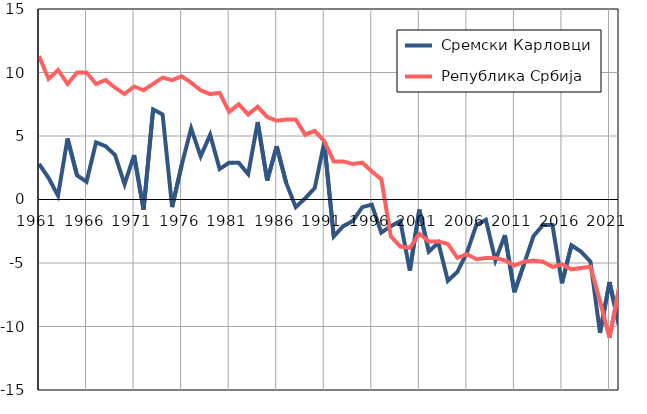
| Category |  Сремски Карловци |  Република Србија |
|---|---|---|
| 1961.0 | 2.8 | 11.3 |
| 1962.0 | 1.7 | 9.5 |
| 1963.0 | 0.3 | 10.2 |
| 1964.0 | 4.8 | 9.1 |
| 1965.0 | 1.9 | 10 |
| 1966.0 | 1.4 | 10 |
| 1967.0 | 4.5 | 9.1 |
| 1968.0 | 4.2 | 9.4 |
| 1969.0 | 3.5 | 8.8 |
| 1970.0 | 1.2 | 8.3 |
| 1971.0 | 3.5 | 8.9 |
| 1972.0 | -0.8 | 8.6 |
| 1973.0 | 7.1 | 9.1 |
| 1974.0 | 6.7 | 9.6 |
| 1975.0 | -0.6 | 9.4 |
| 1976.0 | 2.7 | 9.7 |
| 1977.0 | 5.6 | 9.2 |
| 1978.0 | 3.4 | 8.6 |
| 1979.0 | 5.1 | 8.3 |
| 1980.0 | 2.4 | 8.4 |
| 1981.0 | 2.9 | 6.9 |
| 1982.0 | 2.9 | 7.5 |
| 1983.0 | 2 | 6.7 |
| 1984.0 | 6.1 | 7.3 |
| 1985.0 | 1.5 | 6.5 |
| 1986.0 | 4.2 | 6.2 |
| 1987.0 | 1.3 | 6.3 |
| 1988.0 | -0.6 | 6.3 |
| 1989.0 | 0.1 | 5.1 |
| 1990.0 | 0.9 | 5.4 |
| 1991.0 | 4.5 | 4.6 |
| 1992.0 | -2.9 | 3 |
| 1993.0 | -2.1 | 3 |
| 1994.0 | -1.7 | 2.8 |
| 1995.0 | -0.6 | 2.9 |
| 1996.0 | -0.4 | 2.2 |
| 1997.0 | -2.6 | 1.6 |
| 1998.0 | -2.1 | -2.9 |
| 1999.0 | -1.7 | -3.7 |
| 2000.0 | -5.6 | -3.8 |
| 2001.0 | -0.8 | -2.7 |
| 2002.0 | -4.1 | -3.3 |
| 2003.0 | -3.4 | -3.3 |
| 2004.0 | -6.4 | -3.5 |
| 2005.0 | -5.7 | -4.6 |
| 2006.0 | -4.2 | -4.3 |
| 2007.0 | -2 | -4.7 |
| 2008.0 | -1.6 | -4.6 |
| 2009.0 | -4.8 | -4.6 |
| 2010.0 | -2.8 | -4.8 |
| 2011.0 | -7.3 | -5.2 |
| 2012.0 | -5.1 | -4.9 |
| 2013.0 | -2.9 | -4.8 |
| 2014.0 | -2 | -4.9 |
| 2015.0 | -2 | -5.3 |
| 2016.0 | -6.6 | -5.1 |
| 2017.0 | -3.6 | -5.5 |
| 2018.0 | -4.1 | -5.4 |
| 2019.0 | -4.9 | -5.3 |
| 2020.0 | -10.5 | -8 |
| 2021.0 | -6.5 | -10.9 |
| 2022.0 | -9.9 | -7 |